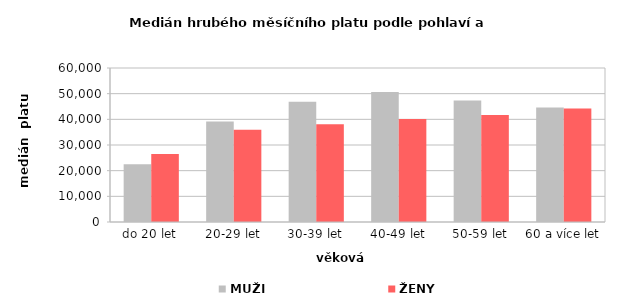
| Category | MUŽI | ŽENY |
|---|---|---|
| 0 | 22452.833 | 26537.001 |
| 1 | 39122.354 | 35958.009 |
| 2 | 46898.794 | 38080.523 |
| 3 | 50638.707 | 40144.756 |
| 4 | 47329.815 | 41669.053 |
| 5 | 44591.414 | 44206.688 |